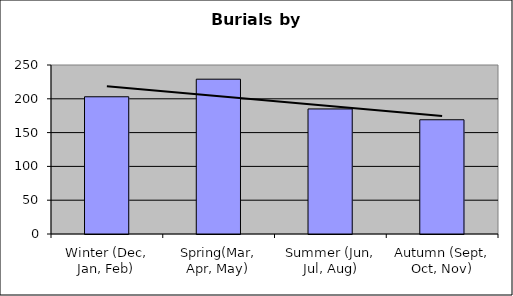
| Category | Series 0 |
|---|---|
| Winter (Dec, Jan, Feb) | 203 |
| Spring(Mar, Apr, May) | 229 |
| Summer (Jun, Jul, Aug) | 185 |
| Autumn (Sept, Oct, Nov) | 169 |